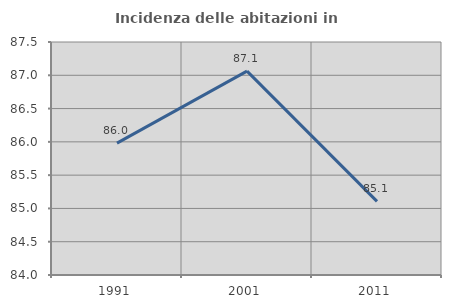
| Category | Incidenza delle abitazioni in proprietà  |
|---|---|
| 1991.0 | 85.98 |
| 2001.0 | 87.062 |
| 2011.0 | 85.106 |